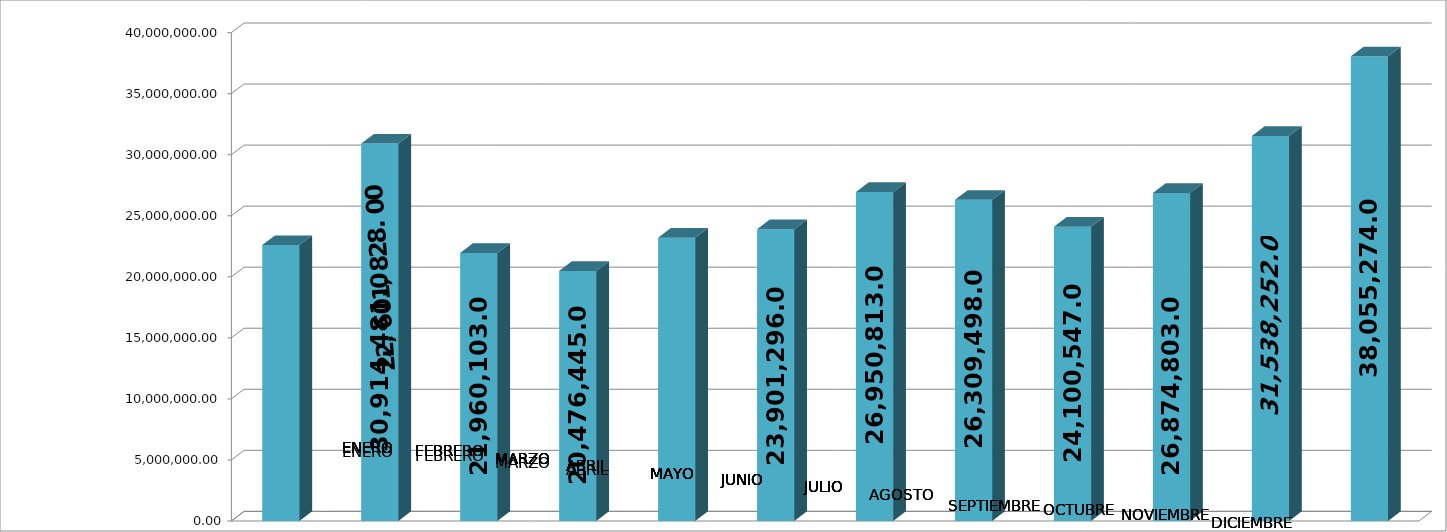
| Category | Series 0 |
|---|---|
| 0 | 22601828 |
| 1 | 30914481 |
| 2 | 21960103 |
| 3 | 20476445 |
| 4 | 23202859 |
| 5 | 23901296 |
| 6 | 26950813 |
| 7 | 26309498 |
| 8 | 24100547 |
| 9 | 26874803 |
| 10 | 31538252 |
| 11 | 38055274 |